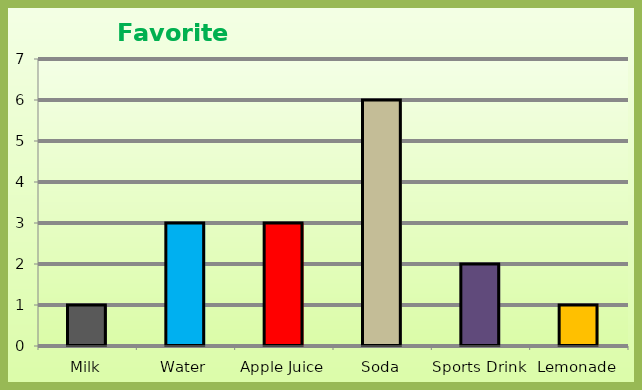
| Category | Series 0 |
|---|---|
| Milk | 1 |
| Water | 3 |
| Apple Juice | 3 |
| Soda | 6 |
| Sports Drink | 2 |
| Lemonade | 1 |